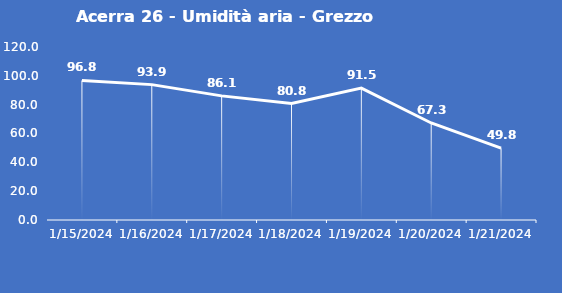
| Category | Acerra 26 - Umidità aria - Grezzo (%) |
|---|---|
| 1/15/24 | 96.8 |
| 1/16/24 | 93.9 |
| 1/17/24 | 86.1 |
| 1/18/24 | 80.8 |
| 1/19/24 | 91.5 |
| 1/20/24 | 67.3 |
| 1/21/24 | 49.8 |